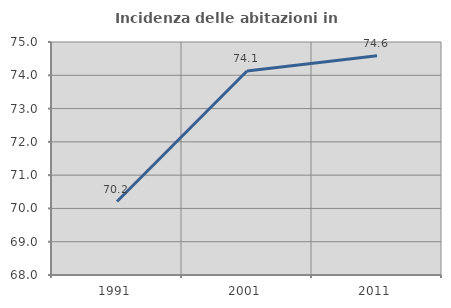
| Category | Incidenza delle abitazioni in proprietà  |
|---|---|
| 1991.0 | 70.206 |
| 2001.0 | 74.128 |
| 2011.0 | 74.586 |